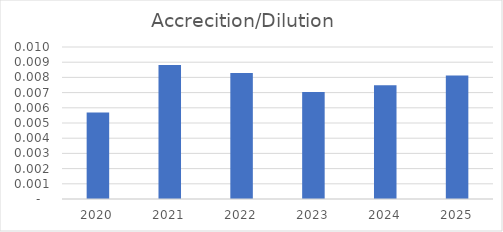
| Category | Accrecition/Dilution |
|---|---|
| 2020.0 | 0.006 |
| 2021.0 | 0.009 |
| 2022.0 | 0.008 |
| 2023.0 | 0.007 |
| 2024.0 | 0.007 |
| 2025.0 | 0.008 |